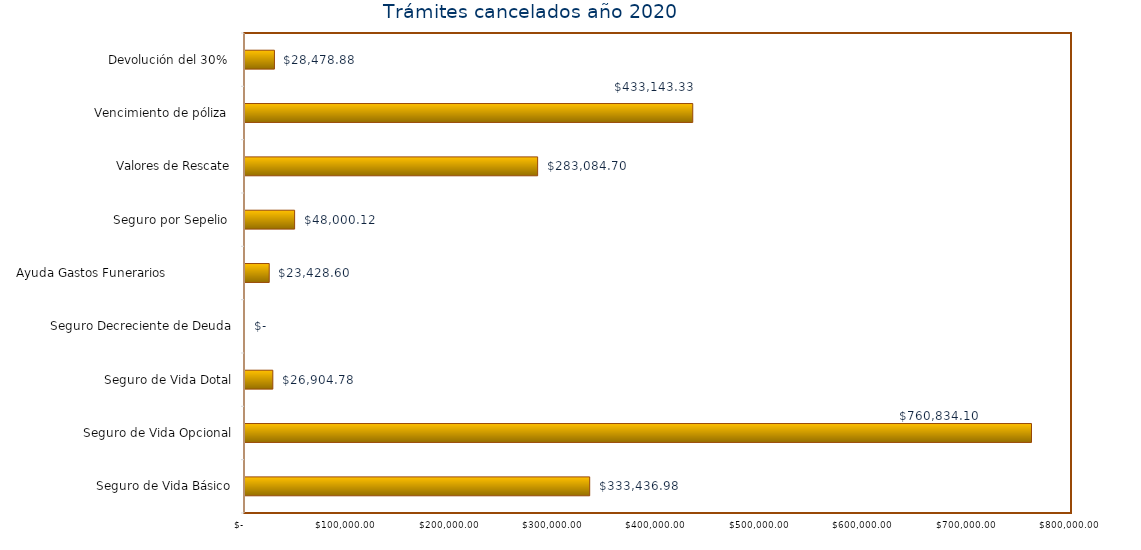
| Category | Monto  |
|---|---|
| Seguro de Vida Básico | 333436.98 |
| Seguro de Vida Opcional | 760834.1 |
| Seguro de Vida Dotal | 26904.78 |
| Seguro Decreciente de Deuda | 0 |
| Ayuda Gastos Funerarios                  | 23428.6 |
| Seguro por Sepelio  | 48000.12 |
| Valores de Rescate | 283084.7 |
| Vencimiento de póliza  | 433143.33 |
| Devolución del 30%  | 28478.88 |